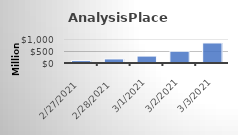
| Category | AnalysisPlace Revenue |
|---|---|
| 2/27/21 | 100000000 |
| 2/28/21 | 170000000 |
| 3/1/21 | 289000000 |
| 3/2/21 | 491300000 |
| 3/3/21 | 835210000 |